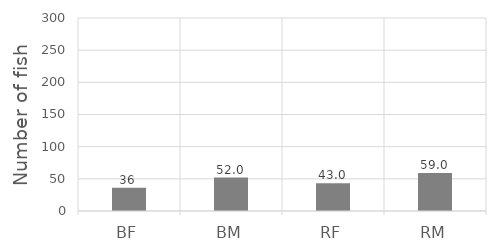
| Category | Series 0 |
|---|---|
| BF | 36 |
| BM | 52 |
| RF | 43 |
| RM | 59 |